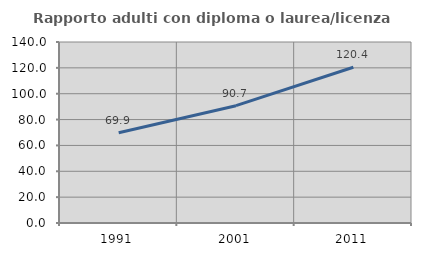
| Category | Rapporto adulti con diploma o laurea/licenza media  |
|---|---|
| 1991.0 | 69.851 |
| 2001.0 | 90.737 |
| 2011.0 | 120.444 |